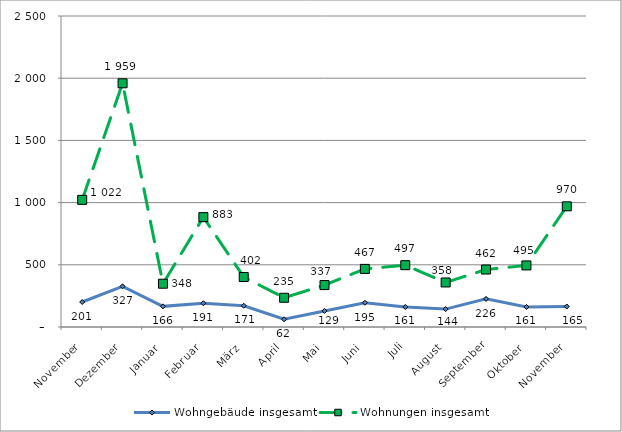
| Category | Wohngebäude insgesamt | Wohnungen insgesamt |
|---|---|---|
| November | 201 | 1022 |
| Dezember | 327 | 1959 |
| Januar | 166 | 348 |
| Februar | 191 | 883 |
| März | 171 | 402 |
| April | 62 | 235 |
| Mai | 129 | 337 |
| Juni | 195 | 467 |
| Juli | 161 | 497 |
| August | 144 | 358 |
| September | 226 | 462 |
| Oktober | 161 | 495 |
| November | 165 | 970 |